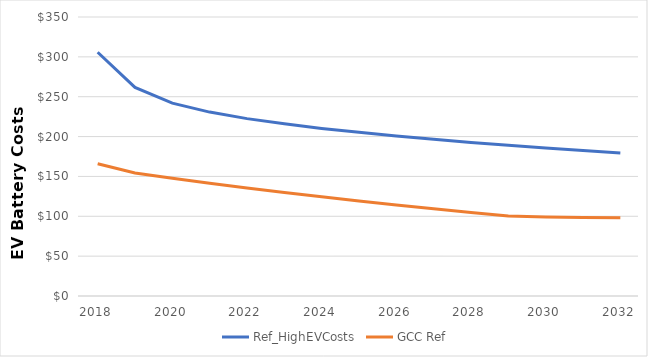
| Category | Ref_HighEVCosts | GCC Ref |
|---|---|---|
| 2018.0 | 305.8 | 166 |
| 2019.0 | 261.7 | 154.25 |
| 2020.0 | 241.9 | 147.769 |
| 2021.0 | 230.7 | 141.555 |
| 2022.0 | 222.5 | 135.603 |
| 2023.0 | 216 | 129.901 |
| 2024.0 | 210.2 | 124.438 |
| 2025.0 | 205.3 | 119.206 |
| 2026.0 | 200.8 | 114.193 |
| 2027.0 | 196.6 | 109.391 |
| 2028.0 | 192.6 | 104.791 |
| 2029.0 | 189 | 100.385 |
| 2030.0 | 185.6 | 99 |
| 2031.0 | 182.4 | 98.55 |
| 2032.0 | 179.5 | 98.1 |